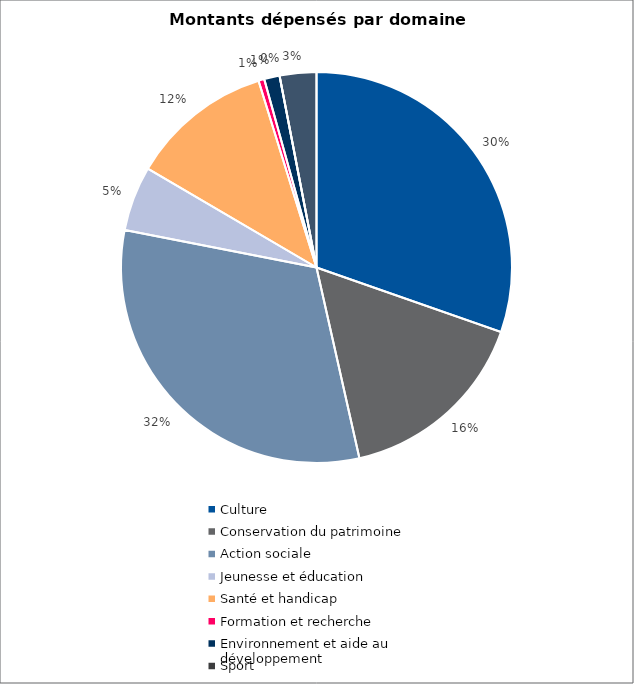
| Category | Series 0 |
|---|---|
| Culture | 10688036 |
| Conservation du patrimoine | 5675000 |
| Action sociale | 11123500 |
| Jeunesse et éducation | 1887500 |
| Santé et handicap | 4147800 |
| Formation et recherche | 170000 |
| Environnement et aide au
développement | 449000 |
| Sport | 0 |
| Autres projets d’utilité publique | 1067500 |